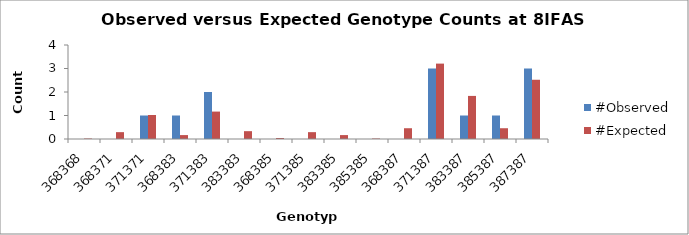
| Category | #Observed | #Expected |
|---|---|---|
| 368368.0 | 0 | 0.021 |
| 368371.0 | 0 | 0.292 |
| 371371.0 | 1 | 1.021 |
| 368383.0 | 1 | 0.167 |
| 371383.0 | 2 | 1.167 |
| 383383.0 | 0 | 0.333 |
| 368385.0 | 0 | 0.042 |
| 371385.0 | 0 | 0.292 |
| 383385.0 | 0 | 0.167 |
| 385385.0 | 0 | 0.021 |
| 368387.0 | 0 | 0.458 |
| 371387.0 | 3 | 3.208 |
| 383387.0 | 1 | 1.833 |
| 385387.0 | 1 | 0.458 |
| 387387.0 | 3 | 2.521 |